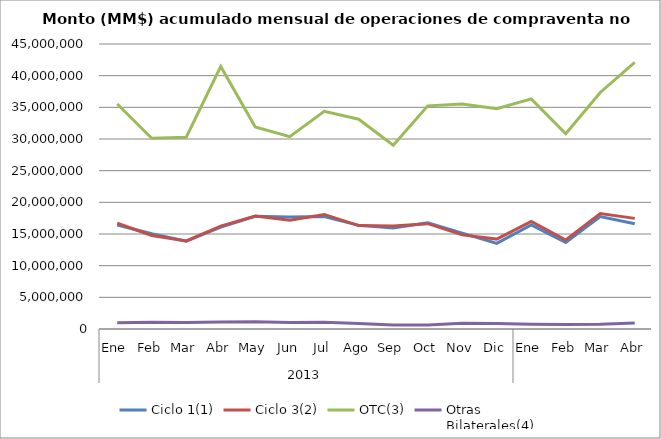
| Category | Ciclo 1(1) | Ciclo 3(2) | OTC(3) | Otras
Bilaterales(4) |
|---|---|---|---|---|
| 0 | 16417241.727 | 16700335.202 | 35523809.408 | 972958.086 |
| 1 | 15037741.172 | 14773657.586 | 30102338.851 | 1073496.596 |
| 2 | 13848943.779 | 13900402.205 | 30273669.122 | 1026617.054 |
| 3 | 16086096.035 | 16245696.168 | 41465554.082 | 1105720.368 |
| 4 | 17801790.619 | 17838763.351 | 31909646.654 | 1133512.85 |
| 5 | 17684542.956 | 17179330.609 | 30372188.279 | 1025162.543 |
| 6 | 17771623.451 | 18089502.524 | 34376831.202 | 1053340.718 |
| 7 | 16359818.954 | 16327115.519 | 33128143.288 | 882723.558 |
| 8 | 15949862.744 | 16281684.387 | 29025705.039 | 624893.462 |
| 9 | 16760948.703 | 16634867.291 | 35234004.542 | 641647.876 |
| 10 | 15133528.556 | 14863555.208 | 35512550.02 | 915020.525 |
| 11 | 13509827.678 | 14192849.668 | 34769513.126 | 877765.247 |
| 12 | 16434121.823 | 16973216.875 | 36341658.718 | 750147.378 |
| 13 | 13675521.943 | 14060199.134 | 30828680.35 | 721919.806 |
| 14 | 17760484.117 | 18231676.991 | 37344676.439 | 768460.999 |
| 15 | 16615436.994 | 17468955.339 | 42094978.158 | 945494.284 |